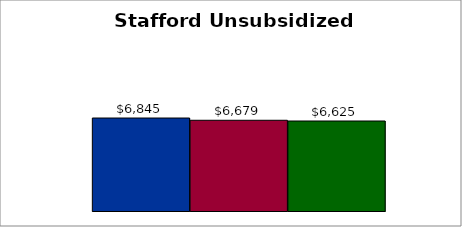
| Category | 50 states and D.C. | SREB states | State |
|---|---|---|---|
| 0 | 6845.38 | 6678.747 | 6625.433 |